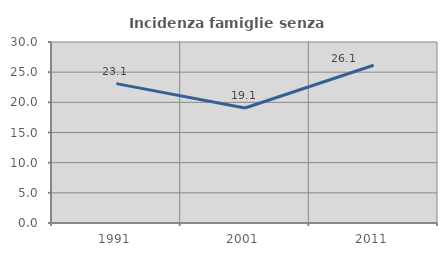
| Category | Incidenza famiglie senza nuclei |
|---|---|
| 1991.0 | 23.104 |
| 2001.0 | 19.065 |
| 2011.0 | 26.14 |